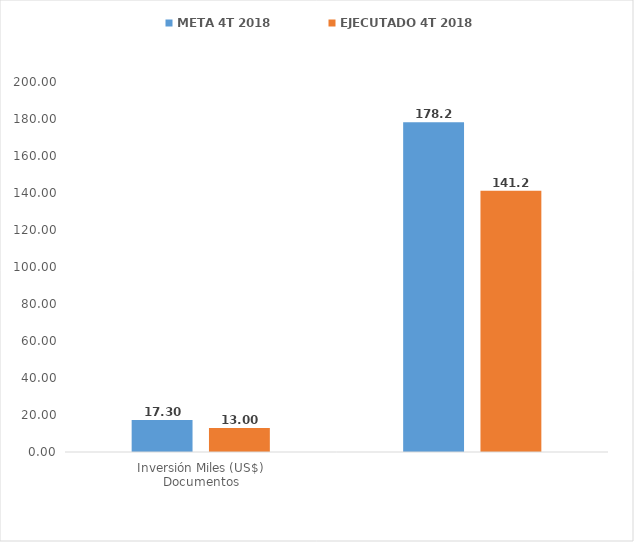
| Category | META 4T 2018 | EJECUTADO 4T 2018 |
|---|---|---|
| 0 | 17.3 | 13 |
| 1 | 178.247 | 141.234 |